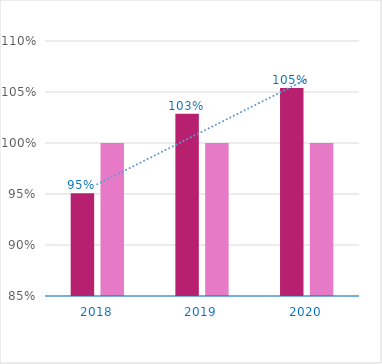
| Category | نسبة الايرادات الفعلية للنفقات الفعلية | المستهدف |
|---|---|---|
| 2018.0 | 0.951 | 1 |
| 2019.0 | 1.029 | 1 |
| 2020.0 | 1.054 | 1 |